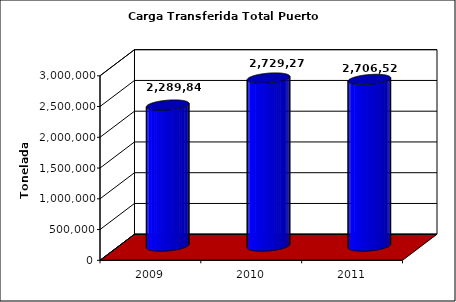
| Category | Series 0 |
|---|---|
| 2009.0 | 2289846.12 |
| 2010.0 | 2729269.71 |
| 2011.0 | 2706525.9 |